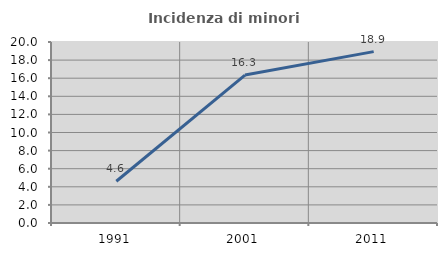
| Category | Incidenza di minori stranieri |
|---|---|
| 1991.0 | 4.615 |
| 2001.0 | 16.346 |
| 2011.0 | 18.935 |